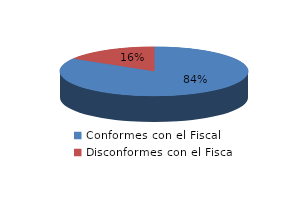
| Category | Series 0 |
|---|---|
| 0 | 175 |
| 1 | 34 |